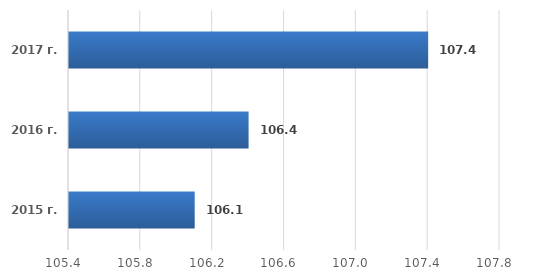
| Category | Series 0 |
|---|---|
| 2015 г. | 106.1 |
| 2016 г. | 106.4 |
| 2017 г. | 107.4 |